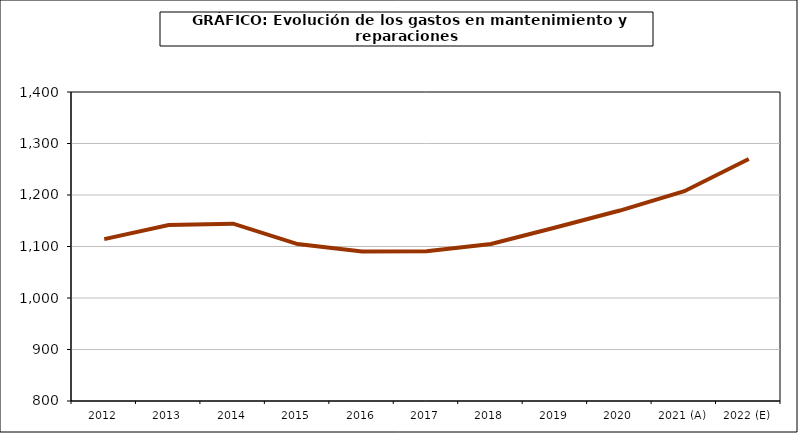
| Category | Series 0 |
|---|---|
| 2012 | 1114.377 |
| 2013 | 1141.575 |
| 2014 | 1144.341 |
| 2015 | 1104.719 |
| 2016 | 1090.39 |
| 2017 | 1090.889 |
| 2018 | 1104.884 |
| 2019 | 1136.967 |
| 2020 | 1169.815 |
| 2021 (A) | 1207.399 |
| 2022 (E) | 1269.949 |